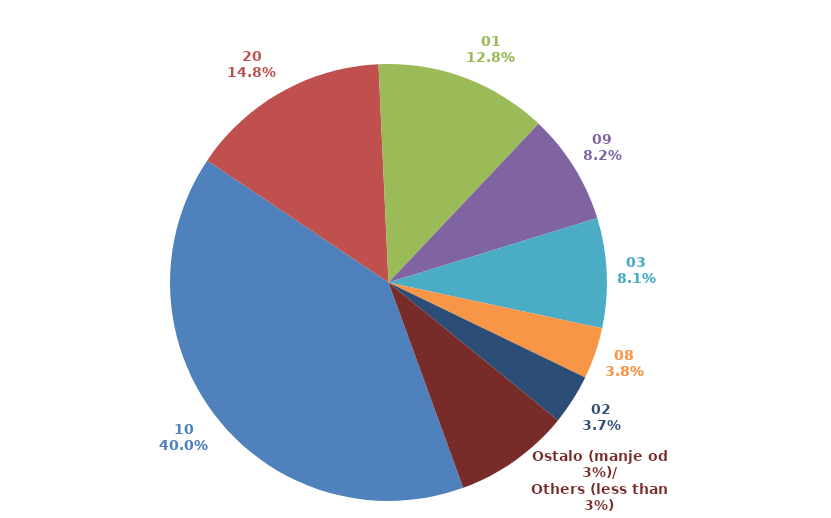
| Category | Series 0 |
|---|---|
| 10 | 0.4 |
| 20 | 0.148 |
| 01 | 0.128 |
| 09 | 0.082 |
| 03 | 0.081 |
| 08 | 0.038 |
| 02 | 0.037 |
| Ostalo (manje od 3%)/
Others (less than 3%) | 0.086 |